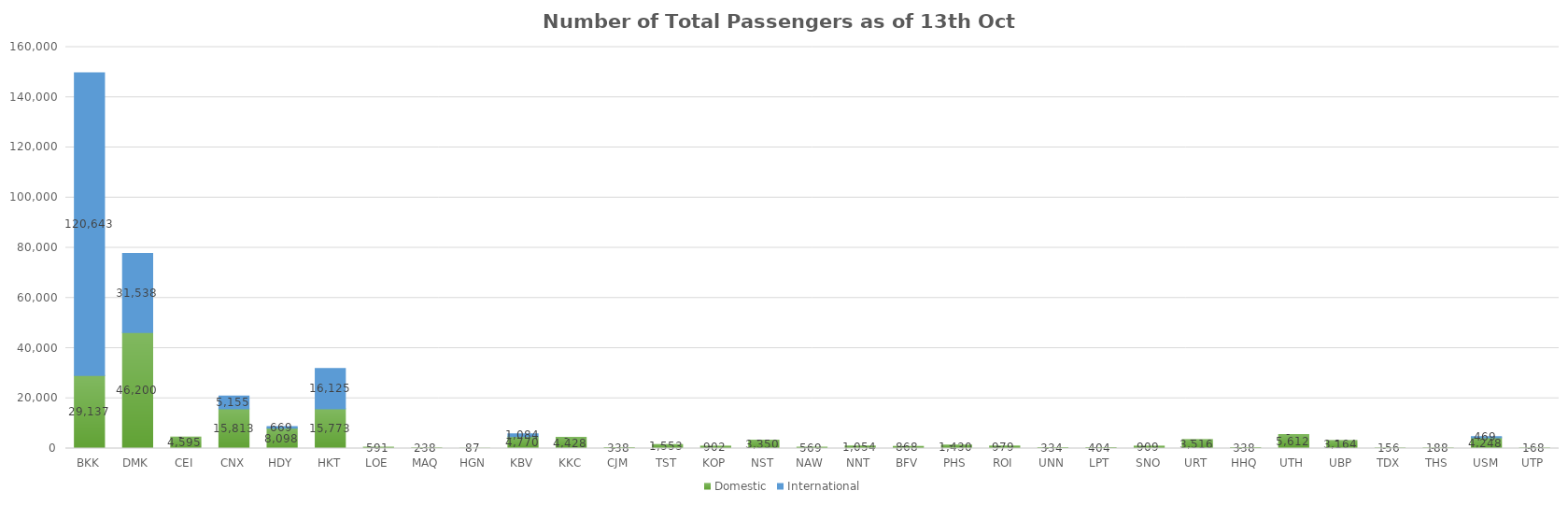
| Category | Domestic | International |
|---|---|---|
| BKK | 29137 | 120643 |
| DMK | 46200 | 31538 |
| CEI | 4595 | 0 |
| CNX | 15813 | 5155 |
| HDY | 8098 | 669 |
| HKT | 15773 | 16125 |
| LOE | 591 | 0 |
| MAQ | 238 | 0 |
| HGN | 87 | 0 |
| KBV | 4770 | 1084 |
| KKC | 4428 | 0 |
| CJM | 338 | 0 |
| TST | 1553 | 0 |
| KOP | 902 | 0 |
| NST | 3350 | 0 |
| NAW | 569 | 0 |
| NNT | 1054 | 0 |
| BFV | 868 | 0 |
| PHS | 1430 | 0 |
| ROI | 979 | 0 |
| UNN | 334 | 0 |
| LPT | 404 | 0 |
| SNO | 909 | 0 |
| URT | 3516 | 0 |
| HHQ | 338 | 0 |
| UTH | 5612 | 0 |
| UBP | 3164 | 0 |
| TDX | 156 | 0 |
| THS | 188 | 0 |
| USM | 4248 | 469 |
| UTP | 168 | 0 |